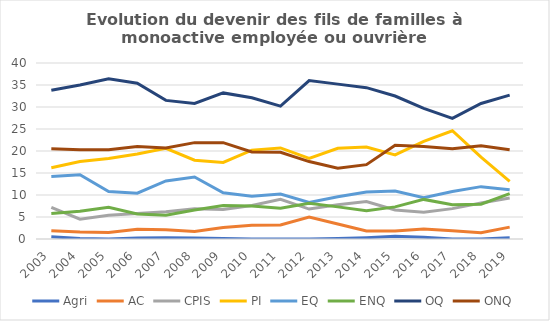
| Category | Agri | AC | CPIS | PI | EQ | ENQ | OQ | ONQ |
|---|---|---|---|---|---|---|---|---|
| 2003.0 | 0.5 | 1.9 | 7.2 | 16.2 | 14.2 | 5.8 | 33.8 | 20.5 |
| 2004.0 | 0.1 | 1.6 | 4.5 | 17.6 | 14.6 | 6.3 | 35 | 20.3 |
| 2005.0 | 0 | 1.5 | 5.4 | 18.3 | 10.8 | 7.2 | 36.4 | 20.3 |
| 2006.0 | 0.2 | 2.2 | 5.8 | 19.3 | 10.4 | 5.7 | 35.4 | 21 |
| 2007.0 | 0.3 | 2.1 | 6.2 | 20.6 | 13.2 | 5.4 | 31.5 | 20.7 |
| 2008.0 | 0.2 | 1.7 | 6.9 | 17.9 | 14.1 | 6.6 | 30.8 | 21.9 |
| 2009.0 | 0.1 | 2.6 | 6.7 | 17.4 | 10.5 | 7.6 | 33.2 | 21.9 |
| 2010.0 | 0 | 3.1 | 7.6 | 20.2 | 9.7 | 7.5 | 32.1 | 19.8 |
| 2011.0 | 0 | 3.2 | 9 | 20.7 | 10.2 | 7 | 30.2 | 19.7 |
| 2012.0 | 0 | 5 | 6.8 | 18.3 | 8.3 | 8.1 | 36 | 17.6 |
| 2013.0 | 0.1 | 3.4 | 7.8 | 20.6 | 9.6 | 7.3 | 35.2 | 16.1 |
| 2014.0 | 0.3 | 1.8 | 8.5 | 20.9 | 10.7 | 6.4 | 34.4 | 16.9 |
| 2015.0 | 0.6 | 1.8 | 6.6 | 19.1 | 10.9 | 7.3 | 32.5 | 21.3 |
| 2016.0 | 0.4 | 2.3 | 6.1 | 22.2 | 9.4 | 9 | 29.7 | 21 |
| 2017.0 | 0 | 1.9 | 6.9 | 24.6 | 10.8 | 7.8 | 27.4 | 20.5 |
| 2018.0 | 0 | 1.4 | 8.2 | 18.6 | 11.9 | 7.9 | 30.8 | 21.2 |
| 2019.0 | 0.3 | 2.7 | 9.3 | 13.1 | 11.2 | 10.3 | 32.7 | 20.3 |